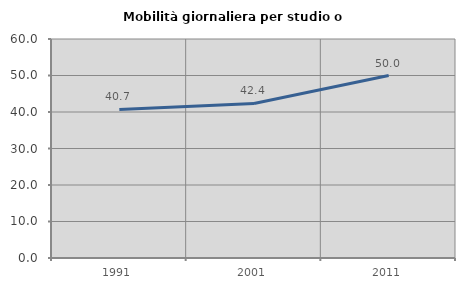
| Category | Mobilità giornaliera per studio o lavoro |
|---|---|
| 1991.0 | 40.707 |
| 2001.0 | 42.353 |
| 2011.0 | 49.984 |